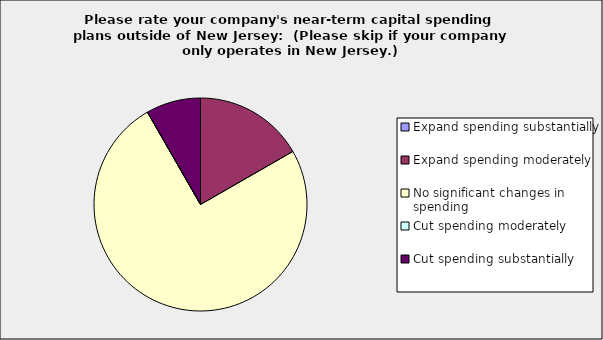
| Category | Series 0 |
|---|---|
| Expand spending substantially | 0 |
| Expand spending moderately | 0.167 |
| No significant changes in spending | 0.75 |
| Cut spending moderately | 0 |
| Cut spending substantially | 0.083 |